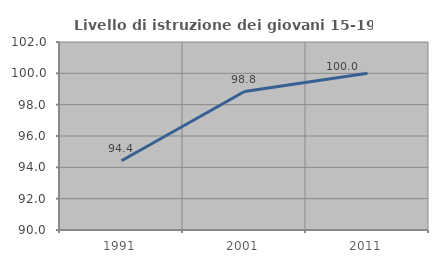
| Category | Livello di istruzione dei giovani 15-19 anni |
|---|---|
| 1991.0 | 94.419 |
| 2001.0 | 98.837 |
| 2011.0 | 100 |